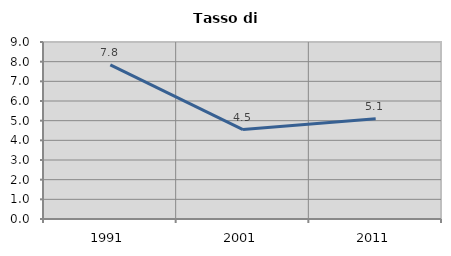
| Category | Tasso di disoccupazione   |
|---|---|
| 1991.0 | 7.841 |
| 2001.0 | 4.549 |
| 2011.0 | 5.094 |